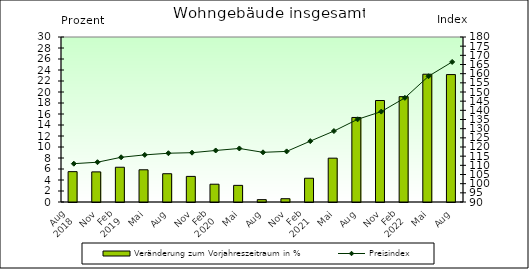
| Category | Veränderung zum Vorjahreszeitraum in % |
|---|---|
| 0 | 5.519 |
| 1 | 5.477 |
| 2 | 6.32 |
| 3 | 5.855 |
| 4 | 5.14 |
| 5 | 4.655 |
| 6 | 3.234 |
| 7 | 3.025 |
| 8 | 0.429 |
| 9 | 0.599 |
| 10 | 4.318 |
| 11 | 7.97 |
| 12 | 15.371 |
| 13 | 18.452 |
| 14 | 19.156 |
| 15 | 23.232 |
| 16 | 23.168 |